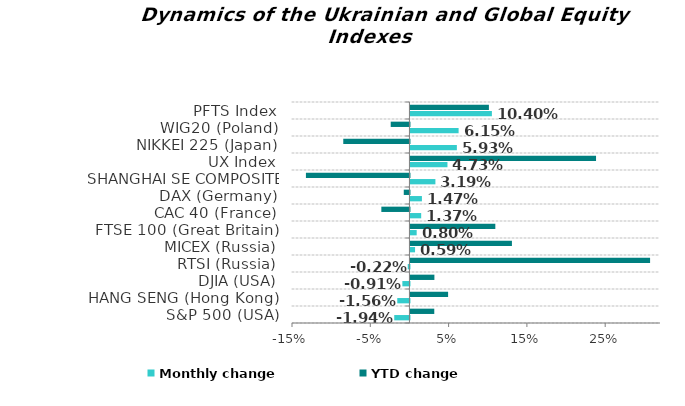
| Category | Monthly change | YTD change |
|---|---|---|
| S&P 500 (USA) | -0.019 | 0.03 |
| HANG SENG (Hong Kong) | -0.016 | 0.048 |
| DJIA (USA) | -0.009 | 0.031 |
| RTSI (Russia) | -0.002 | 0.306 |
| MICEX (Russia) | 0.006 | 0.13 |
| FTSE 100 (Great Britain) | 0.008 | 0.108 |
| CAC 40 (France) | 0.014 | -0.036 |
| DAX (Germany) | 0.015 | -0.007 |
| SHANGHAI SE COMPOSITE (China) | 0.032 | -0.132 |
| UX Index | 0.047 | 0.237 |
| NIKKEI 225 (Japan) | 0.059 | -0.085 |
| WIG20 (Poland) | 0.062 | -0.024 |
| PFTS Index | 0.104 | 0.1 |